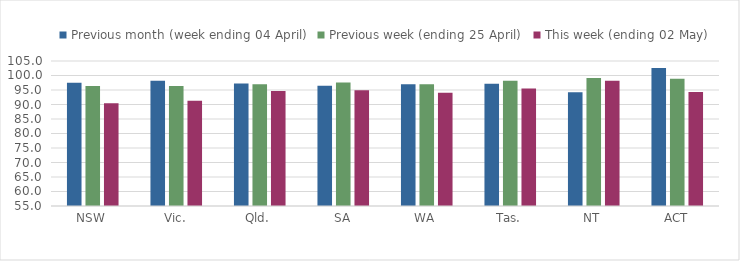
| Category | Previous month (week ending 04 April) | Previous week (ending 25 April) | This week (ending 02 May) |
|---|---|---|---|
| NSW | 97.541 | 96.371 | 90.398 |
| Vic. | 98.18 | 96.417 | 91.25 |
| Qld. | 97.28 | 97.02 | 94.675 |
| SA | 96.442 | 97.561 | 94.93 |
| WA | 96.958 | 96.96 | 94.036 |
| Tas. | 97.178 | 98.218 | 95.516 |
| NT | 94.206 | 99.128 | 98.165 |
| ACT | 102.547 | 98.857 | 94.313 |